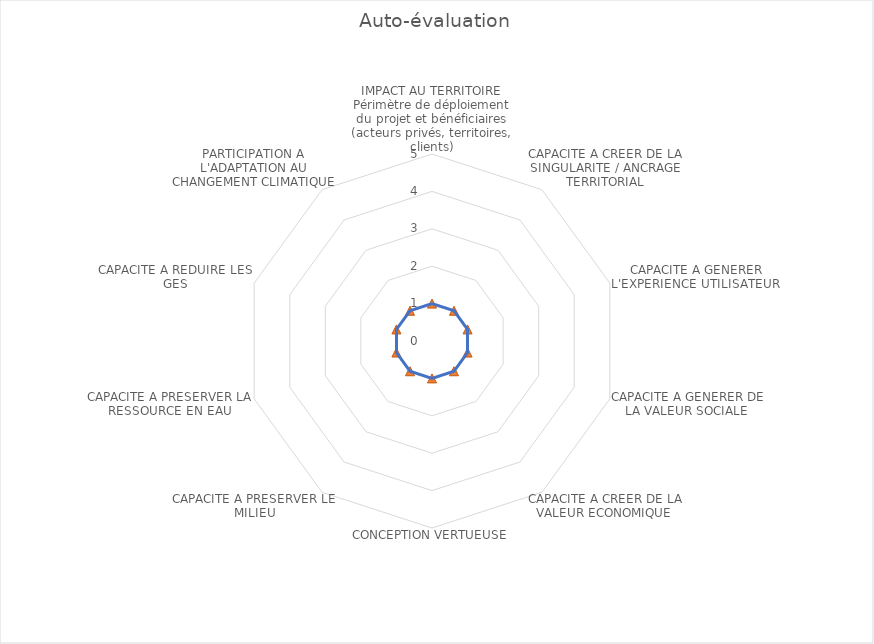
| Category | Série1 |
|---|---|
| IMPACT AU TERRITOIRE
Périmètre de déploiement du projet et bénéficiaires (acteurs privés, territoires, clients) | 1 |
| CAPACITE A CREER DE LA SINGULARITE / ANCRAGE TERRITORIAL | 1 |
| CAPACITE A GENERER L'EXPERIENCE UTILISATEUR  | 1 |
| CAPACITE A GENERER DE LA VALEUR SOCIALE  | 1 |
| CAPACITE A CREER DE LA VALEUR ECONOMIQUE  | 1 |
| CONCEPTION VERTUEUSE | 1 |
| CAPACITE A PRESERVER LE MILIEU | 1 |
| CAPACITE A PRESERVER LA RESSOURCE EN EAU | 1 |
| CAPACITE A REDUIRE LES GES | 1 |
| PARTICIPATION A L'ADAPTATION AU CHANGEMENT CLIMATIQUE | 1 |